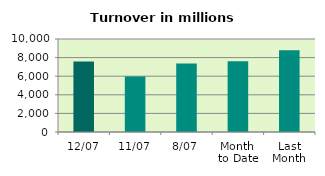
| Category | Series 0 |
|---|---|
| 12/07 | 7577.859 |
| 11/07 | 5956.46 |
| 8/07 | 7373.032 |
| Month 
to Date | 7597.276 |
| Last
Month | 8790.45 |